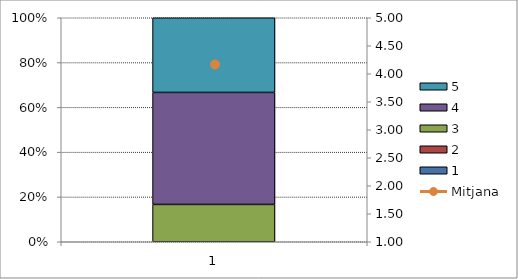
| Category | 1 | 2 | 3 | 4 | 5 |
|---|---|---|---|---|---|
| 0 | 0 | 0 | 2 | 6 | 4 |